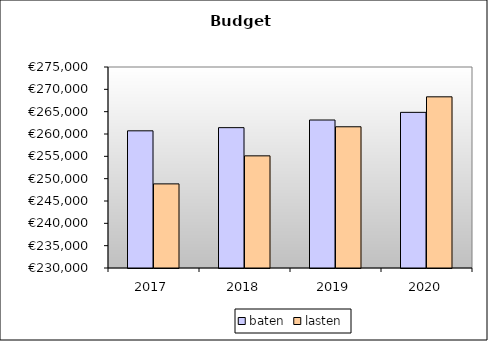
| Category | baten | lasten |
|---|---|---|
| 2017.0 | 260710.251 | 248830.802 |
| 2018.0 | 261423.193 | 255106.366 |
| 2019.0 | 263134.253 | 261619.592 |
| 2020.0 | 264845.313 | 268325.327 |